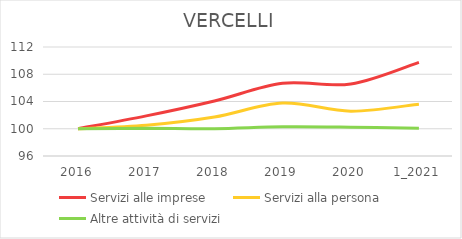
| Category | Servizi alle imprese | Servizi alla persona | Altre attività di servizi |
|---|---|---|---|
| 2016 | 100 | 100 | 100 |
| 2017 | 101.891 | 100.516 | 100.056 |
| 2018 | 104.08 | 101.72 | 100 |
| 2019 | 106.667 | 103.783 | 100.28 |
| 2020 | 106.567 | 102.58 | 100.224 |
| 1_2021 | 109.751 | 103.611 | 100.056 |